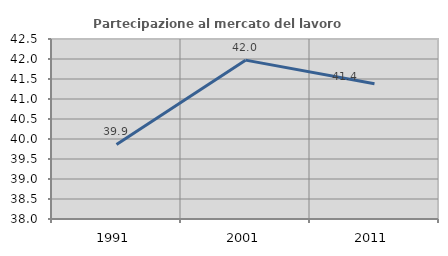
| Category | Partecipazione al mercato del lavoro  femminile |
|---|---|
| 1991.0 | 39.863 |
| 2001.0 | 41.972 |
| 2011.0 | 41.383 |